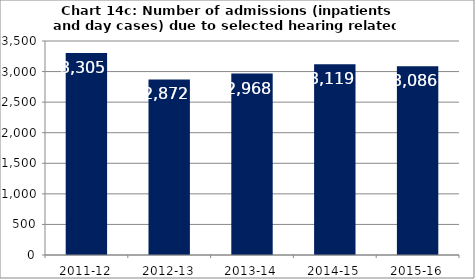
| Category | Chart 14c: Number of admissions (inpatients and day cases) due to selected hearing related procedures |
|---|---|
| 2011-12 | 3305 |
| 2012-13 | 2872 |
| 2013-14 | 2968 |
| 2014-15 | 3119 |
| 2015-16 | 3086 |